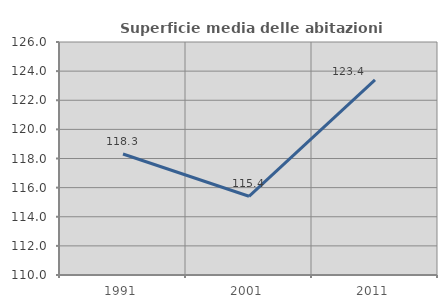
| Category | Superficie media delle abitazioni occupate |
|---|---|
| 1991.0 | 118.309 |
| 2001.0 | 115.406 |
| 2011.0 | 123.399 |